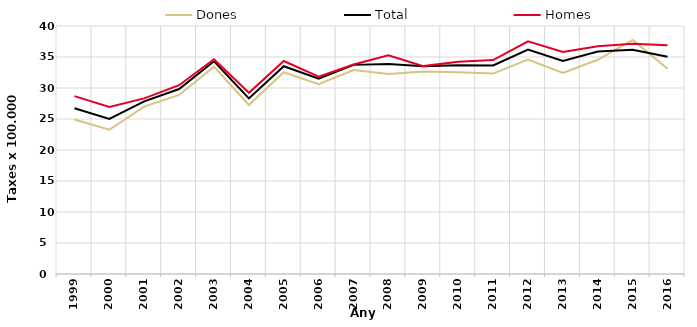
| Category | Dones | Total | Homes |
|---|---|---|---|
| 1999.0 | 24.91 | 26.73 | 28.69 |
| 2000.0 | 23.27 | 25 | 26.96 |
| 2001.0 | 27 | 27.85 | 28.32 |
| 2002.0 | 28.88 | 29.83 | 30.45 |
| 2003.0 | 33.44 | 34.31 | 34.63 |
| 2004.0 | 27.26 | 28.32 | 29.22 |
| 2005.0 | 32.55 | 33.51 | 34.36 |
| 2006.0 | 30.61 | 31.49 | 31.84 |
| 2007.0 | 32.9 | 33.73 | 33.8 |
| 2008.0 | 32.24 | 33.87 | 35.26 |
| 2009.0 | 32.67 | 33.49 | 33.53 |
| 2010.0 | 32.55 | 33.65 | 34.24 |
| 2011.0 | 32.33 | 33.63 | 34.51 |
| 2012.0 | 34.59 | 36.21 | 37.54 |
| 2013.0 | 32.42 | 34.38 | 35.81 |
| 2014.0 | 34.55 | 35.88 | 36.74 |
| 2015.0 | 37.75 | 36.15 | 37.14 |
| 2016.0 | 33.09 | 35.04 | 36.91 |